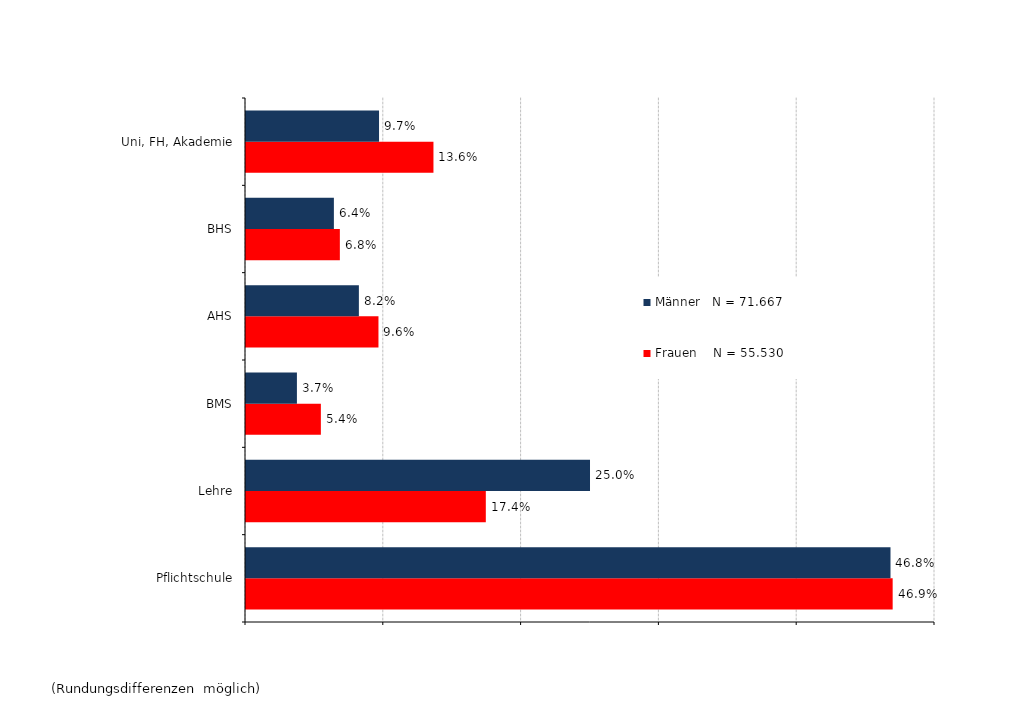
| Category | Frauen    N = 55.530 | Männer   N = 71.667 |
|---|---|---|
| Pflichtschule | 0.469 | 0.468 |
| Lehre | 0.174 | 0.25 |
| BMS | 0.054 | 0.037 |
| AHS | 0.096 | 0.082 |
| BHS | 0.068 | 0.064 |
| Uni, FH, Akademie | 0.136 | 0.097 |